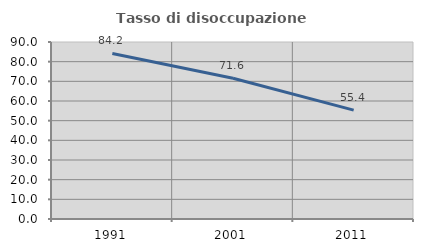
| Category | Tasso di disoccupazione giovanile  |
|---|---|
| 1991.0 | 84.188 |
| 2001.0 | 71.552 |
| 2011.0 | 55.357 |